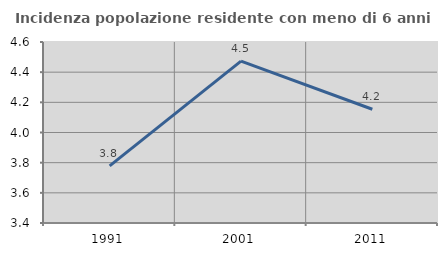
| Category | Incidenza popolazione residente con meno di 6 anni |
|---|---|
| 1991.0 | 3.778 |
| 2001.0 | 4.474 |
| 2011.0 | 4.154 |